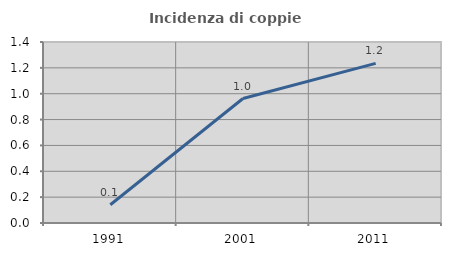
| Category | Incidenza di coppie miste |
|---|---|
| 1991.0 | 0.141 |
| 2001.0 | 0.963 |
| 2011.0 | 1.235 |